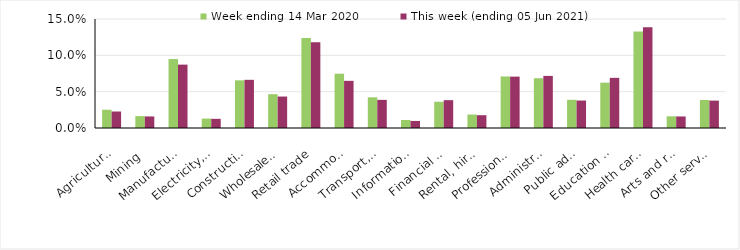
| Category | Week ending 14 Mar 2020 | This week (ending 05 Jun 2021) |
|---|---|---|
| Agriculture, forestry and fishing | 0.025 | 0.023 |
| Mining | 0.016 | 0.016 |
| Manufacturing | 0.095 | 0.087 |
| Electricity, gas, water and waste services | 0.013 | 0.013 |
| Construction | 0.066 | 0.066 |
| Wholesale trade | 0.046 | 0.043 |
| Retail trade | 0.124 | 0.118 |
| Accommodation and food services | 0.075 | 0.065 |
| Transport, postal and warehousing | 0.042 | 0.039 |
| Information media and telecommunications | 0.011 | 0.01 |
| Financial and insurance services | 0.036 | 0.038 |
| Rental, hiring and real estate services | 0.018 | 0.018 |
| Professional, scientific and technical services | 0.071 | 0.071 |
| Administrative and support services | 0.068 | 0.072 |
| Public administration and safety | 0.039 | 0.038 |
| Education and training | 0.062 | 0.069 |
| Health care and social assistance | 0.133 | 0.138 |
| Arts and recreation services | 0.016 | 0.016 |
| Other services | 0.038 | 0.038 |